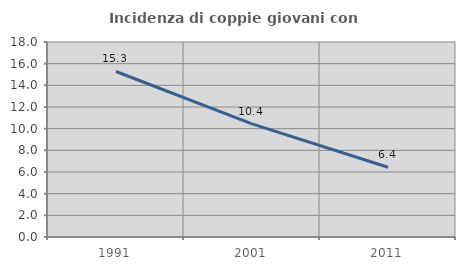
| Category | Incidenza di coppie giovani con figli |
|---|---|
| 1991.0 | 15.278 |
| 2001.0 | 10.438 |
| 2011.0 | 6.435 |